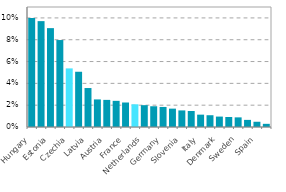
| Category | Series 0 |
|---|---|
| Hungary | 0.1 |
| Finland | 0.097 |
| Estonia | 0.091 |
| Ireland | 0.08 |
| Czechia | 0.054 |
| Slovakia | 0.051 |
| Latvia | 0.036 |
| Poland | 0.025 |
| Austria | 0.025 |
| Portugal | 0.024 |
| France | 0.022 |
| EU28 | 0.021 |
| Netherlands | 0.02 |
| Romania | 0.019 |
| Germany | 0.018 |
| Croatia | 0.017 |
| Slovenia | 0.015 |
| United Kingdom | 0.015 |
| Italy | 0.011 |
| Bulgaria | 0.011 |
| Denmark | 0.01 |
| Belgium | 0.009 |
| Sweden | 0.009 |
| Lithuania | 0.007 |
| Spain | 0.005 |
| Greece | 0.003 |